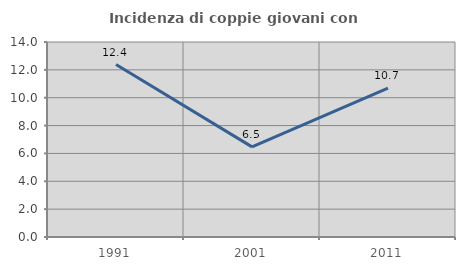
| Category | Incidenza di coppie giovani con figli |
|---|---|
| 1991.0 | 12.383 |
| 2001.0 | 6.471 |
| 2011.0 | 10.69 |